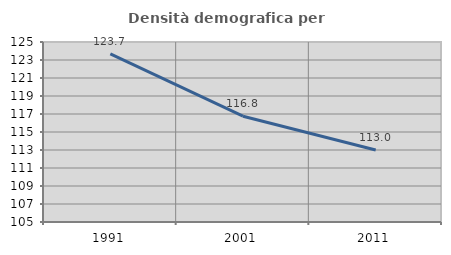
| Category | Densità demografica |
|---|---|
| 1991.0 | 123.684 |
| 2001.0 | 116.756 |
| 2011.0 | 112.999 |